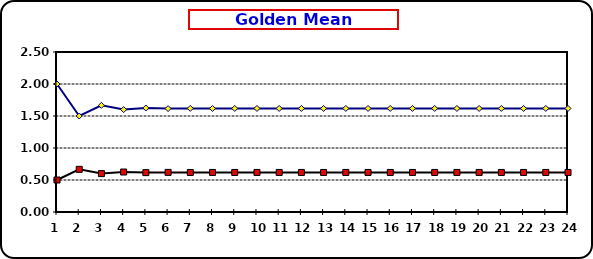
| Category | Series 0 | Series 1 |
|---|---|---|
| 0 | 2 | 0.5 |
| 1 | 1.5 | 0.667 |
| 2 | 1.667 | 0.6 |
| 3 | 1.6 | 0.625 |
| 4 | 1.625 | 0.615 |
| 5 | 1.615 | 0.619 |
| 6 | 1.619 | 0.618 |
| 7 | 1.618 | 0.618 |
| 8 | 1.618 | 0.618 |
| 9 | 1.618 | 0.618 |
| 10 | 1.618 | 0.618 |
| 11 | 1.618 | 0.618 |
| 12 | 1.618 | 0.618 |
| 13 | 1.618 | 0.618 |
| 14 | 1.618 | 0.618 |
| 15 | 1.618 | 0.618 |
| 16 | 1.618 | 0.618 |
| 17 | 1.618 | 0.618 |
| 18 | 1.618 | 0.618 |
| 19 | 1.618 | 0.618 |
| 20 | 1.618 | 0.618 |
| 21 | 1.618 | 0.618 |
| 22 | 1.618 | 0.618 |
| 23 | 1.618 | 0.618 |